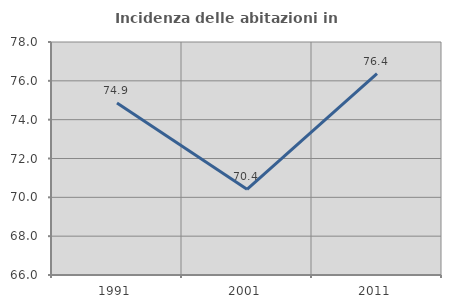
| Category | Incidenza delle abitazioni in proprietà  |
|---|---|
| 1991.0 | 74.86 |
| 2001.0 | 70.414 |
| 2011.0 | 76.374 |